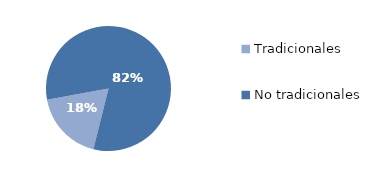
| Category | Series 0 |
|---|---|
| Tradicionales | 652.462 |
| No tradicionales | 2923.135 |